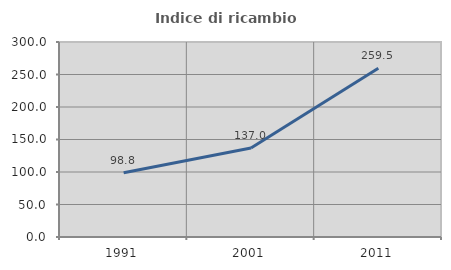
| Category | Indice di ricambio occupazionale  |
|---|---|
| 1991.0 | 98.807 |
| 2001.0 | 137.042 |
| 2011.0 | 259.519 |